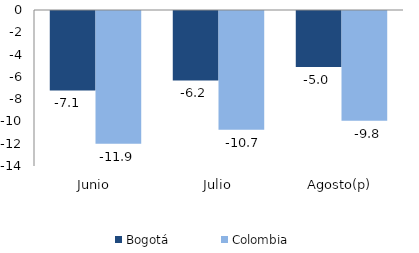
| Category | Bogotá | Colombia |
|---|---|---|
| Junio | -7.133 | -11.923 |
| Julio | -6.228 | -10.665 |
| Agosto(p) | -5.036 | -9.84 |